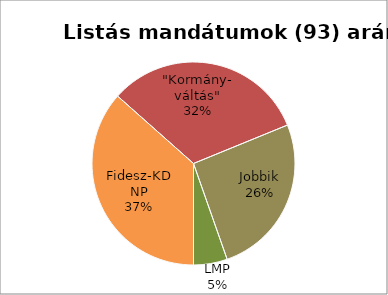
| Category | Listás |
|---|---|
| Fidesz-KDNP | 34 |
| "Kormány-
váltás" | 30 |
| Jobbik | 24 |
| LMP | 5 |